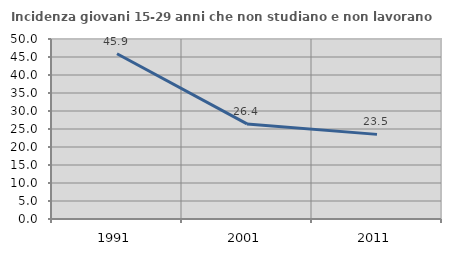
| Category | Incidenza giovani 15-29 anni che non studiano e non lavorano  |
|---|---|
| 1991.0 | 45.917 |
| 2001.0 | 26.408 |
| 2011.0 | 23.506 |